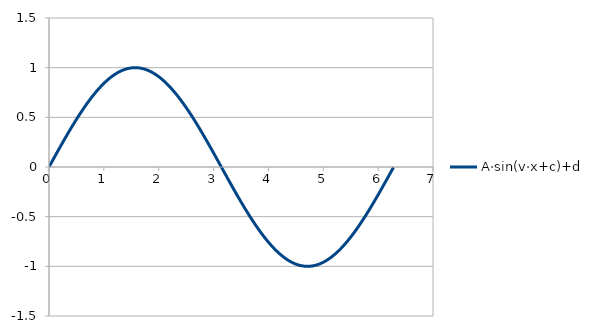
| Category | A·sin(v·x+c)+d |
|---|---|
| 0.0 | 0 |
| 0.00628 | 0.006 |
| 0.01256 | 0.013 |
| 0.01884 | 0.019 |
| 0.02512 | 0.025 |
| 0.0314 | 0.031 |
| 0.03768 | 0.038 |
| 0.04396 | 0.044 |
| 0.05024 | 0.05 |
| 0.05652 | 0.056 |
| 0.0628 | 0.063 |
| 0.06908 | 0.069 |
| 0.07536 | 0.075 |
| 0.08164 | 0.082 |
| 0.08792 | 0.088 |
| 0.0942 | 0.094 |
| 0.10048 | 0.1 |
| 0.10676 | 0.107 |
| 0.11304 | 0.113 |
| 0.11932 | 0.119 |
| 0.1256 | 0.125 |
| 0.13188 | 0.131 |
| 0.13816 | 0.138 |
| 0.14444 | 0.144 |
| 0.15072 | 0.15 |
| 0.157 | 0.156 |
| 0.16328 | 0.163 |
| 0.16956 | 0.169 |
| 0.17584 | 0.175 |
| 0.18212 | 0.181 |
| 0.1884 | 0.187 |
| 0.19468 | 0.193 |
| 0.20096 | 0.2 |
| 0.20724 | 0.206 |
| 0.21352 | 0.212 |
| 0.2198 | 0.218 |
| 0.22608 | 0.224 |
| 0.23236 | 0.23 |
| 0.23864 | 0.236 |
| 0.24492 | 0.242 |
| 0.2512 | 0.249 |
| 0.25748 | 0.255 |
| 0.26376 | 0.261 |
| 0.27004 | 0.267 |
| 0.27632 | 0.273 |
| 0.2826 | 0.279 |
| 0.28888 | 0.285 |
| 0.29516 | 0.291 |
| 0.30144 | 0.297 |
| 0.30772 | 0.303 |
| 0.314 | 0.309 |
| 0.32028 | 0.315 |
| 0.32656 | 0.321 |
| 0.33284 | 0.327 |
| 0.33912 | 0.333 |
| 0.3454 | 0.339 |
| 0.35168 | 0.344 |
| 0.35796 | 0.35 |
| 0.36424 | 0.356 |
| 0.37052 | 0.362 |
| 0.3768 | 0.368 |
| 0.38308 | 0.374 |
| 0.38936 | 0.38 |
| 0.39564 | 0.385 |
| 0.40192 | 0.391 |
| 0.4082 | 0.397 |
| 0.41448 | 0.403 |
| 0.42076 | 0.408 |
| 0.42704 | 0.414 |
| 0.43332 | 0.42 |
| 0.4396 | 0.426 |
| 0.44588 | 0.431 |
| 0.45216 | 0.437 |
| 0.45844 | 0.443 |
| 0.46472 | 0.448 |
| 0.471 | 0.454 |
| 0.47728 | 0.459 |
| 0.48356 | 0.465 |
| 0.48984 | 0.47 |
| 0.49612 | 0.476 |
| 0.5024 | 0.482 |
| 0.50868 | 0.487 |
| 0.51496 | 0.493 |
| 0.52124 | 0.498 |
| 0.52752 | 0.503 |
| 0.5338 | 0.509 |
| 0.54008 | 0.514 |
| 0.54636 | 0.52 |
| 0.55264 | 0.525 |
| 0.55892 | 0.53 |
| 0.5652 | 0.536 |
| 0.57148 | 0.541 |
| 0.57776 | 0.546 |
| 0.58404 | 0.551 |
| 0.59032 | 0.557 |
| 0.5966 | 0.562 |
| 0.60288 | 0.567 |
| 0.60916 | 0.572 |
| 0.61544 | 0.577 |
| 0.62172 | 0.582 |
| 0.627999999999999 | 0.588 |
| 0.634279999999999 | 0.593 |
| 0.640559999999999 | 0.598 |
| 0.646839999999999 | 0.603 |
| 0.653119999999999 | 0.608 |
| 0.659399999999999 | 0.613 |
| 0.665679999999999 | 0.618 |
| 0.671959999999999 | 0.623 |
| 0.678239999999999 | 0.627 |
| 0.684519999999999 | 0.632 |
| 0.690799999999999 | 0.637 |
| 0.697079999999999 | 0.642 |
| 0.703359999999999 | 0.647 |
| 0.709639999999999 | 0.652 |
| 0.715919999999999 | 0.656 |
| 0.722199999999999 | 0.661 |
| 0.728479999999999 | 0.666 |
| 0.734759999999999 | 0.67 |
| 0.741039999999999 | 0.675 |
| 0.747319999999999 | 0.68 |
| 0.753599999999998 | 0.684 |
| 0.759879999999998 | 0.689 |
| 0.766159999999998 | 0.693 |
| 0.772439999999998 | 0.698 |
| 0.778719999999998 | 0.702 |
| 0.784999999999998 | 0.707 |
| 0.791279999999998 | 0.711 |
| 0.797559999999998 | 0.716 |
| 0.803839999999998 | 0.72 |
| 0.810119999999998 | 0.724 |
| 0.816399999999998 | 0.729 |
| 0.822679999999998 | 0.733 |
| 0.828959999999998 | 0.737 |
| 0.835239999999998 | 0.741 |
| 0.841519999999998 | 0.746 |
| 0.847799999999998 | 0.75 |
| 0.854079999999998 | 0.754 |
| 0.860359999999998 | 0.758 |
| 0.866639999999998 | 0.762 |
| 0.872919999999998 | 0.766 |
| 0.879199999999998 | 0.77 |
| 0.885479999999997 | 0.774 |
| 0.891759999999997 | 0.778 |
| 0.898039999999997 | 0.782 |
| 0.904319999999997 | 0.786 |
| 0.910599999999997 | 0.79 |
| 0.916879999999997 | 0.794 |
| 0.923159999999997 | 0.798 |
| 0.929439999999997 | 0.801 |
| 0.935719999999997 | 0.805 |
| 0.941999999999997 | 0.809 |
| 0.948279999999997 | 0.812 |
| 0.954559999999997 | 0.816 |
| 0.960839999999997 | 0.82 |
| 0.967119999999997 | 0.823 |
| 0.973399999999997 | 0.827 |
| 0.979679999999997 | 0.83 |
| 0.985959999999997 | 0.834 |
| 0.992239999999997 | 0.837 |
| 0.998519999999997 | 0.841 |
| 1.0048 | 0.844 |
| 1.01108 | 0.847 |
| 1.01736 | 0.851 |
| 1.02364 | 0.854 |
| 1.02992 | 0.857 |
| 1.0362 | 0.86 |
| 1.04248 | 0.864 |
| 1.04876 | 0.867 |
| 1.05504 | 0.87 |
| 1.06132 | 0.873 |
| 1.0676 | 0.876 |
| 1.07388 | 0.879 |
| 1.08016 | 0.882 |
| 1.08644 | 0.885 |
| 1.09272 | 0.888 |
| 1.099 | 0.891 |
| 1.10528 | 0.894 |
| 1.11156 | 0.896 |
| 1.11784 | 0.899 |
| 1.12412 | 0.902 |
| 1.1304 | 0.905 |
| 1.13668 | 0.907 |
| 1.14296 | 0.91 |
| 1.14924 | 0.912 |
| 1.15552 | 0.915 |
| 1.1618 | 0.918 |
| 1.16808 | 0.92 |
| 1.17436 | 0.922 |
| 1.18064 | 0.925 |
| 1.18692 | 0.927 |
| 1.1932 | 0.93 |
| 1.19948 | 0.932 |
| 1.20576 | 0.934 |
| 1.21204 | 0.936 |
| 1.21832 | 0.939 |
| 1.2246 | 0.941 |
| 1.23088 | 0.943 |
| 1.23716 | 0.945 |
| 1.24344 | 0.947 |
| 1.24972 | 0.949 |
| 1.256 | 0.951 |
| 1.26228 | 0.953 |
| 1.26856 | 0.955 |
| 1.27484 | 0.957 |
| 1.28112 | 0.958 |
| 1.2874 | 0.96 |
| 1.29368 | 0.962 |
| 1.29996 | 0.964 |
| 1.30624 | 0.965 |
| 1.31252 | 0.967 |
| 1.3188 | 0.968 |
| 1.32508 | 0.97 |
| 1.33136 | 0.971 |
| 1.33764 | 0.973 |
| 1.34392 | 0.974 |
| 1.3502 | 0.976 |
| 1.35648 | 0.977 |
| 1.36276 | 0.978 |
| 1.36904 | 0.98 |
| 1.37532 | 0.981 |
| 1.3816 | 0.982 |
| 1.38788 | 0.983 |
| 1.39416 | 0.984 |
| 1.40044 | 0.986 |
| 1.40672 | 0.987 |
| 1.413 | 0.988 |
| 1.41928 | 0.989 |
| 1.42556 | 0.989 |
| 1.43184 | 0.99 |
| 1.43812 | 0.991 |
| 1.4444 | 0.992 |
| 1.45068 | 0.993 |
| 1.45696 | 0.994 |
| 1.46324 | 0.994 |
| 1.46952 | 0.995 |
| 1.4758 | 0.995 |
| 1.48208 | 0.996 |
| 1.48836 | 0.997 |
| 1.49464 | 0.997 |
| 1.50092 | 0.998 |
| 1.5072 | 0.998 |
| 1.51348 | 0.998 |
| 1.51976 | 0.999 |
| 1.52604 | 0.999 |
| 1.53232 | 0.999 |
| 1.5386 | 0.999 |
| 1.54488 | 1 |
| 1.55116 | 1 |
| 1.55744 | 1 |
| 1.56372 | 1 |
| 1.57 | 1 |
| 1.57628 | 1 |
| 1.58256 | 1 |
| 1.58884 | 1 |
| 1.59512 | 1 |
| 1.6014 | 1 |
| 1.60768 | 0.999 |
| 1.61396 | 0.999 |
| 1.62024 | 0.999 |
| 1.62652 | 0.998 |
| 1.6328 | 0.998 |
| 1.63908 | 0.998 |
| 1.64536 | 0.997 |
| 1.65164 | 0.997 |
| 1.65792 | 0.996 |
| 1.6642 | 0.996 |
| 1.67048 | 0.995 |
| 1.67676 | 0.994 |
| 1.68304 | 0.994 |
| 1.68932 | 0.993 |
| 1.6956 | 0.992 |
| 1.70188 | 0.991 |
| 1.70816 | 0.991 |
| 1.71444 | 0.99 |
| 1.72072 | 0.989 |
| 1.727 | 0.988 |
| 1.73328 | 0.987 |
| 1.73956 | 0.986 |
| 1.74584 | 0.985 |
| 1.75212 | 0.984 |
| 1.7584 | 0.982 |
| 1.76468 | 0.981 |
| 1.77096 | 0.98 |
| 1.77724 | 0.979 |
| 1.78352 | 0.977 |
| 1.7898 | 0.976 |
| 1.79608 | 0.975 |
| 1.80236 | 0.973 |
| 1.80864 | 0.972 |
| 1.81492 | 0.97 |
| 1.8212 | 0.969 |
| 1.82748000000001 | 0.967 |
| 1.83376000000001 | 0.966 |
| 1.84004000000001 | 0.964 |
| 1.84632000000001 | 0.962 |
| 1.85260000000001 | 0.961 |
| 1.85888000000001 | 0.959 |
| 1.86516000000001 | 0.957 |
| 1.87144000000001 | 0.955 |
| 1.87772000000001 | 0.953 |
| 1.88400000000001 | 0.951 |
| 1.89028000000001 | 0.949 |
| 1.89656000000001 | 0.947 |
| 1.90284000000001 | 0.945 |
| 1.90912000000001 | 0.943 |
| 1.91540000000001 | 0.941 |
| 1.92168000000001 | 0.939 |
| 1.92796000000001 | 0.937 |
| 1.93424000000001 | 0.935 |
| 1.94052000000001 | 0.932 |
| 1.94680000000001 | 0.93 |
| 1.95308000000001 | 0.928 |
| 1.95936000000001 | 0.925 |
| 1.96564000000001 | 0.923 |
| 1.97192000000001 | 0.921 |
| 1.97820000000001 | 0.918 |
| 1.98448000000001 | 0.916 |
| 1.99076000000001 | 0.913 |
| 1.99704000000001 | 0.911 |
| 2.00332000000001 | 0.908 |
| 2.00960000000001 | 0.905 |
| 2.01588000000001 | 0.903 |
| 2.02216000000001 | 0.9 |
| 2.02844000000001 | 0.897 |
| 2.03472000000001 | 0.894 |
| 2.04100000000001 | 0.891 |
| 2.04728000000001 | 0.889 |
| 2.05356000000001 | 0.886 |
| 2.05984000000001 | 0.883 |
| 2.06612 | 0.88 |
| 2.0724 | 0.877 |
| 2.07868 | 0.874 |
| 2.08496 | 0.871 |
| 2.09124 | 0.868 |
| 2.09752 | 0.864 |
| 2.1038 | 0.861 |
| 2.11008 | 0.858 |
| 2.11636 | 0.855 |
| 2.12264 | 0.852 |
| 2.12892 | 0.848 |
| 2.1352 | 0.845 |
| 2.14148 | 0.842 |
| 2.14776 | 0.838 |
| 2.15404 | 0.835 |
| 2.16032 | 0.831 |
| 2.1666 | 0.828 |
| 2.17288 | 0.824 |
| 2.17916 | 0.821 |
| 2.18544 | 0.817 |
| 2.19172 | 0.813 |
| 2.198 | 0.81 |
| 2.20428 | 0.806 |
| 2.21056 | 0.802 |
| 2.21684 | 0.798 |
| 2.22312 | 0.795 |
| 2.2294 | 0.791 |
| 2.23568 | 0.787 |
| 2.24196 | 0.783 |
| 2.24824 | 0.779 |
| 2.25452 | 0.775 |
| 2.2608 | 0.771 |
| 2.26708 | 0.767 |
| 2.27336 | 0.763 |
| 2.27964 | 0.759 |
| 2.28592 | 0.755 |
| 2.2922 | 0.751 |
| 2.29848 | 0.747 |
| 2.30476 | 0.743 |
| 2.31104 | 0.738 |
| 2.31732 | 0.734 |
| 2.3236 | 0.73 |
| 2.32988 | 0.725 |
| 2.33616 | 0.721 |
| 2.34244 | 0.717 |
| 2.34872 | 0.712 |
| 2.355 | 0.708 |
| 2.36128 | 0.704 |
| 2.36756 | 0.699 |
| 2.37384 | 0.695 |
| 2.38012 | 0.69 |
| 2.3864 | 0.685 |
| 2.39268 | 0.681 |
| 2.39896 | 0.676 |
| 2.40524 | 0.672 |
| 2.41152 | 0.667 |
| 2.4178 | 0.662 |
| 2.42408 | 0.658 |
| 2.43036 | 0.653 |
| 2.43664 | 0.648 |
| 2.44292 | 0.643 |
| 2.4492 | 0.638 |
| 2.45548 | 0.634 |
| 2.46175999999999 | 0.629 |
| 2.46803999999999 | 0.624 |
| 2.47431999999999 | 0.619 |
| 2.48059999999999 | 0.614 |
| 2.48687999999999 | 0.609 |
| 2.49315999999999 | 0.604 |
| 2.49943999999999 | 0.599 |
| 2.50571999999999 | 0.594 |
| 2.51199999999999 | 0.589 |
| 2.51827999999999 | 0.584 |
| 2.52455999999999 | 0.579 |
| 2.53083999999999 | 0.573 |
| 2.53711999999999 | 0.568 |
| 2.54339999999999 | 0.563 |
| 2.54967999999999 | 0.558 |
| 2.55595999999999 | 0.553 |
| 2.56223999999999 | 0.547 |
| 2.56851999999999 | 0.542 |
| 2.57479999999999 | 0.537 |
| 2.58107999999999 | 0.532 |
| 2.58735999999999 | 0.526 |
| 2.59363999999999 | 0.521 |
| 2.59991999999999 | 0.516 |
| 2.60619999999999 | 0.51 |
| 2.61247999999999 | 0.505 |
| 2.61875999999999 | 0.499 |
| 2.62503999999999 | 0.494 |
| 2.63131999999999 | 0.488 |
| 2.63759999999999 | 0.483 |
| 2.64387999999999 | 0.477 |
| 2.65015999999999 | 0.472 |
| 2.65643999999999 | 0.466 |
| 2.66271999999999 | 0.461 |
| 2.66899999999999 | 0.455 |
| 2.67527999999999 | 0.45 |
| 2.68155999999999 | 0.444 |
| 2.68783999999999 | 0.438 |
| 2.69411999999999 | 0.433 |
| 2.70039999999999 | 0.427 |
| 2.70667999999999 | 0.421 |
| 2.71295999999999 | 0.416 |
| 2.71923999999999 | 0.41 |
| 2.72551999999999 | 0.404 |
| 2.73179999999999 | 0.398 |
| 2.73807999999999 | 0.393 |
| 2.74435999999999 | 0.387 |
| 2.75063999999999 | 0.381 |
| 2.75691999999999 | 0.375 |
| 2.76319999999999 | 0.369 |
| 2.76947999999999 | 0.364 |
| 2.77575999999999 | 0.358 |
| 2.78203999999999 | 0.352 |
| 2.78831999999999 | 0.346 |
| 2.79459999999999 | 0.34 |
| 2.80087999999999 | 0.334 |
| 2.80715999999999 | 0.328 |
| 2.81343999999999 | 0.322 |
| 2.81971999999999 | 0.316 |
| 2.82599999999999 | 0.31 |
| 2.83227999999999 | 0.304 |
| 2.83855999999999 | 0.298 |
| 2.84483999999999 | 0.292 |
| 2.85111999999999 | 0.286 |
| 2.85739999999998 | 0.28 |
| 2.86367999999998 | 0.274 |
| 2.86995999999998 | 0.268 |
| 2.87623999999998 | 0.262 |
| 2.88251999999998 | 0.256 |
| 2.88879999999998 | 0.25 |
| 2.89507999999998 | 0.244 |
| 2.90135999999998 | 0.238 |
| 2.90763999999998 | 0.232 |
| 2.91391999999998 | 0.226 |
| 2.92019999999998 | 0.22 |
| 2.92647999999998 | 0.213 |
| 2.93275999999998 | 0.207 |
| 2.93903999999998 | 0.201 |
| 2.94531999999998 | 0.195 |
| 2.95159999999998 | 0.189 |
| 2.95787999999998 | 0.183 |
| 2.96415999999998 | 0.177 |
| 2.97043999999998 | 0.17 |
| 2.97671999999998 | 0.164 |
| 2.98299999999998 | 0.158 |
| 2.98927999999998 | 0.152 |
| 2.99555999999998 | 0.146 |
| 3.00183999999998 | 0.139 |
| 3.00811999999998 | 0.133 |
| 3.01439999999998 | 0.127 |
| 3.02067999999998 | 0.121 |
| 3.02695999999998 | 0.114 |
| 3.03323999999998 | 0.108 |
| 3.03951999999998 | 0.102 |
| 3.04579999999998 | 0.096 |
| 3.05207999999998 | 0.089 |
| 3.05835999999998 | 0.083 |
| 3.06463999999998 | 0.077 |
| 3.07091999999998 | 0.071 |
| 3.07719999999998 | 0.064 |
| 3.08347999999998 | 0.058 |
| 3.08975999999998 | 0.052 |
| 3.09603999999998 | 0.046 |
| 3.10231999999998 | 0.039 |
| 3.10859999999998 | 0.033 |
| 3.11487999999998 | 0.027 |
| 3.12115999999998 | 0.02 |
| 3.12743999999998 | 0.014 |
| 3.13371999999998 | 0.008 |
| 3.13999999999998 | 0.002 |
| 3.14627999999998 | -0.005 |
| 3.15255999999998 | -0.011 |
| 3.15883999999998 | -0.017 |
| 3.16511999999998 | -0.024 |
| 3.17139999999998 | -0.03 |
| 3.17767999999998 | -0.036 |
| 3.18395999999998 | -0.042 |
| 3.19023999999998 | -0.049 |
| 3.19651999999998 | -0.055 |
| 3.20279999999998 | -0.061 |
| 3.20907999999998 | -0.067 |
| 3.21535999999998 | -0.074 |
| 3.22163999999998 | -0.08 |
| 3.22791999999998 | -0.086 |
| 3.23419999999998 | -0.092 |
| 3.24047999999998 | -0.099 |
| 3.24675999999998 | -0.105 |
| 3.25303999999997 | -0.111 |
| 3.25931999999997 | -0.117 |
| 3.26559999999997 | -0.124 |
| 3.27187999999997 | -0.13 |
| 3.27815999999997 | -0.136 |
| 3.28443999999997 | -0.142 |
| 3.29071999999997 | -0.149 |
| 3.29699999999997 | -0.155 |
| 3.30327999999997 | -0.161 |
| 3.30955999999997 | -0.167 |
| 3.31583999999997 | -0.173 |
| 3.32211999999997 | -0.18 |
| 3.32839999999997 | -0.186 |
| 3.33467999999997 | -0.192 |
| 3.34095999999997 | -0.198 |
| 3.34723999999997 | -0.204 |
| 3.35351999999997 | -0.21 |
| 3.35979999999997 | -0.216 |
| 3.36607999999997 | -0.223 |
| 3.37235999999997 | -0.229 |
| 3.37863999999997 | -0.235 |
| 3.38491999999997 | -0.241 |
| 3.39119999999997 | -0.247 |
| 3.39747999999997 | -0.253 |
| 3.40375999999997 | -0.259 |
| 3.41003999999997 | -0.265 |
| 3.41631999999997 | -0.271 |
| 3.42259999999997 | -0.277 |
| 3.42887999999997 | -0.283 |
| 3.43515999999997 | -0.289 |
| 3.44143999999997 | -0.295 |
| 3.44771999999997 | -0.301 |
| 3.45399999999997 | -0.307 |
| 3.46027999999997 | -0.313 |
| 3.46655999999997 | -0.319 |
| 3.47283999999997 | -0.325 |
| 3.47911999999997 | -0.331 |
| 3.48539999999997 | -0.337 |
| 3.49167999999997 | -0.343 |
| 3.49795999999997 | -0.349 |
| 3.50423999999997 | -0.355 |
| 3.51051999999997 | -0.361 |
| 3.51679999999997 | -0.366 |
| 3.52307999999997 | -0.372 |
| 3.52935999999997 | -0.378 |
| 3.53563999999997 | -0.384 |
| 3.54191999999997 | -0.39 |
| 3.54819999999997 | -0.395 |
| 3.55447999999997 | -0.401 |
| 3.56075999999997 | -0.407 |
| 3.56703999999997 | -0.413 |
| 3.57331999999997 | -0.418 |
| 3.57959999999997 | -0.424 |
| 3.58587999999997 | -0.43 |
| 3.59215999999997 | -0.435 |
| 3.59843999999997 | -0.441 |
| 3.60471999999997 | -0.447 |
| 3.61099999999997 | -0.452 |
| 3.61727999999997 | -0.458 |
| 3.62355999999997 | -0.464 |
| 3.62983999999997 | -0.469 |
| 3.63611999999997 | -0.475 |
| 3.64239999999997 | -0.48 |
| 3.64867999999996 | -0.486 |
| 3.65495999999996 | -0.491 |
| 3.66123999999996 | -0.497 |
| 3.66751999999996 | -0.502 |
| 3.67379999999996 | -0.507 |
| 3.68007999999996 | -0.513 |
| 3.68635999999996 | -0.518 |
| 3.69263999999996 | -0.524 |
| 3.69891999999996 | -0.529 |
| 3.70519999999996 | -0.534 |
| 3.71147999999996 | -0.54 |
| 3.71775999999996 | -0.545 |
| 3.72403999999996 | -0.55 |
| 3.73031999999996 | -0.555 |
| 3.73659999999996 | -0.561 |
| 3.74287999999996 | -0.566 |
| 3.74915999999996 | -0.571 |
| 3.75543999999996 | -0.576 |
| 3.76171999999996 | -0.581 |
| 3.76799999999996 | -0.586 |
| 3.77427999999996 | -0.591 |
| 3.78055999999996 | -0.596 |
| 3.78683999999996 | -0.601 |
| 3.79311999999996 | -0.606 |
| 3.79939999999996 | -0.611 |
| 3.80567999999996 | -0.616 |
| 3.81195999999996 | -0.621 |
| 3.81823999999996 | -0.626 |
| 3.82451999999996 | -0.631 |
| 3.83079999999996 | -0.636 |
| 3.83707999999996 | -0.641 |
| 3.84335999999996 | -0.646 |
| 3.84963999999996 | -0.65 |
| 3.85591999999996 | -0.655 |
| 3.86219999999996 | -0.66 |
| 3.86847999999996 | -0.665 |
| 3.87475999999996 | -0.669 |
| 3.88103999999996 | -0.674 |
| 3.88731999999996 | -0.679 |
| 3.89359999999996 | -0.683 |
| 3.89987999999996 | -0.688 |
| 3.90615999999996 | -0.692 |
| 3.91243999999996 | -0.697 |
| 3.91871999999996 | -0.701 |
| 3.92499999999996 | -0.706 |
| 3.93127999999996 | -0.71 |
| 3.93755999999996 | -0.715 |
| 3.94383999999996 | -0.719 |
| 3.95011999999996 | -0.723 |
| 3.95639999999996 | -0.728 |
| 3.96267999999996 | -0.732 |
| 3.96895999999996 | -0.736 |
| 3.97523999999996 | -0.74 |
| 3.98151999999996 | -0.745 |
| 3.98779999999996 | -0.749 |
| 3.99407999999996 | -0.753 |
| 4.00035999999996 | -0.757 |
| 4.00663999999996 | -0.761 |
| 4.01291999999996 | -0.765 |
| 4.01919999999996 | -0.769 |
| 4.02547999999996 | -0.773 |
| 4.03175999999996 | -0.777 |
| 4.03803999999996 | -0.781 |
| 4.04431999999996 | -0.785 |
| 4.05059999999996 | -0.789 |
| 4.05687999999996 | -0.793 |
| 4.06315999999996 | -0.797 |
| 4.06943999999996 | -0.8 |
| 4.07571999999996 | -0.804 |
| 4.08199999999996 | -0.808 |
| 4.08827999999996 | -0.811 |
| 4.09455999999996 | -0.815 |
| 4.10083999999996 | -0.819 |
| 4.10711999999996 | -0.822 |
| 4.11339999999996 | -0.826 |
| 4.11967999999996 | -0.829 |
| 4.12595999999996 | -0.833 |
| 4.13223999999996 | -0.836 |
| 4.13851999999996 | -0.84 |
| 4.14479999999996 | -0.843 |
| 4.15107999999996 | -0.847 |
| 4.15735999999996 | -0.85 |
| 4.16363999999996 | -0.853 |
| 4.16991999999996 | -0.856 |
| 4.17619999999996 | -0.86 |
| 4.18247999999996 | -0.863 |
| 4.18875999999997 | -0.866 |
| 4.19503999999997 | -0.869 |
| 4.20131999999997 | -0.872 |
| 4.20759999999997 | -0.875 |
| 4.21387999999997 | -0.878 |
| 4.22015999999997 | -0.881 |
| 4.22643999999997 | -0.884 |
| 4.23271999999997 | -0.887 |
| 4.23899999999997 | -0.89 |
| 4.24527999999997 | -0.893 |
| 4.25155999999997 | -0.896 |
| 4.25783999999997 | -0.898 |
| 4.26411999999997 | -0.901 |
| 4.27039999999997 | -0.904 |
| 4.27667999999997 | -0.907 |
| 4.28295999999997 | -0.909 |
| 4.28923999999997 | -0.912 |
| 4.29551999999997 | -0.914 |
| 4.30179999999997 | -0.917 |
| 4.30807999999997 | -0.919 |
| 4.31435999999997 | -0.922 |
| 4.32063999999997 | -0.924 |
| 4.32691999999997 | -0.927 |
| 4.33319999999997 | -0.929 |
| 4.33947999999997 | -0.931 |
| 4.34575999999997 | -0.934 |
| 4.35203999999997 | -0.936 |
| 4.35831999999997 | -0.938 |
| 4.36459999999997 | -0.94 |
| 4.37087999999997 | -0.942 |
| 4.37715999999997 | -0.944 |
| 4.38343999999997 | -0.946 |
| 4.38971999999997 | -0.948 |
| 4.39599999999997 | -0.95 |
| 4.40227999999997 | -0.952 |
| 4.40855999999998 | -0.954 |
| 4.41483999999998 | -0.956 |
| 4.42111999999998 | -0.958 |
| 4.42739999999998 | -0.96 |
| 4.43367999999998 | -0.961 |
| 4.43995999999998 | -0.963 |
| 4.44623999999998 | -0.965 |
| 4.45251999999998 | -0.966 |
| 4.45879999999998 | -0.968 |
| 4.46507999999998 | -0.97 |
| 4.47135999999998 | -0.971 |
| 4.47763999999998 | -0.973 |
| 4.48391999999998 | -0.974 |
| 4.49019999999998 | -0.975 |
| 4.49647999999998 | -0.977 |
| 4.50275999999998 | -0.978 |
| 4.50903999999998 | -0.979 |
| 4.51531999999998 | -0.981 |
| 4.52159999999998 | -0.982 |
| 4.52787999999998 | -0.983 |
| 4.53415999999998 | -0.984 |
| 4.54043999999998 | -0.985 |
| 4.54671999999998 | -0.986 |
| 4.55299999999998 | -0.987 |
| 4.55927999999998 | -0.988 |
| 4.56555999999998 | -0.989 |
| 4.57183999999998 | -0.99 |
| 4.57811999999998 | -0.991 |
| 4.58439999999998 | -0.992 |
| 4.59067999999998 | -0.993 |
| 4.59695999999998 | -0.993 |
| 4.60323999999998 | -0.994 |
| 4.60951999999998 | -0.995 |
| 4.61579999999998 | -0.995 |
| 4.62207999999998 | -0.996 |
| 4.62835999999999 | -0.996 |
| 4.63463999999999 | -0.997 |
| 4.64091999999999 | -0.997 |
| 4.64719999999999 | -0.998 |
| 4.65347999999999 | -0.998 |
| 4.65975999999999 | -0.999 |
| 4.66603999999999 | -0.999 |
| 4.67231999999999 | -0.999 |
| 4.67859999999999 | -0.999 |
| 4.68487999999999 | -1 |
| 4.69115999999999 | -1 |
| 4.69743999999999 | -1 |
| 4.70371999999999 | -1 |
| 4.70999999999999 | -1 |
| 4.71627999999999 | -1 |
| 4.72255999999999 | -1 |
| 4.72883999999999 | -1 |
| 4.73511999999999 | -1 |
| 4.74139999999999 | -1 |
| 4.74767999999999 | -0.999 |
| 4.75395999999999 | -0.999 |
| 4.76023999999999 | -0.999 |
| 4.76651999999999 | -0.999 |
| 4.77279999999999 | -0.998 |
| 4.77907999999999 | -0.998 |
| 4.78535999999999 | -0.997 |
| 4.79163999999999 | -0.997 |
| 4.79791999999999 | -0.996 |
| 4.80419999999999 | -0.996 |
| 4.81047999999999 | -0.995 |
| 4.81675999999999 | -0.995 |
| 4.82303999999999 | -0.994 |
| 4.82931999999999 | -0.993 |
| 4.83559999999999 | -0.992 |
| 4.84187999999999 | -0.992 |
| 4.84816 | -0.991 |
| 4.85444 | -0.99 |
| 4.86072 | -0.989 |
| 4.867 | -0.988 |
| 4.87328 | -0.987 |
| 4.87956 | -0.986 |
| 4.88584 | -0.985 |
| 4.89212 | -0.984 |
| 4.8984 | -0.983 |
| 4.90468 | -0.982 |
| 4.91096 | -0.98 |
| 4.91724 | -0.979 |
| 4.92352 | -0.978 |
| 4.9298 | -0.976 |
| 4.93608 | -0.975 |
| 4.94236 | -0.974 |
| 4.94864 | -0.972 |
| 4.95492 | -0.971 |
| 4.9612 | -0.969 |
| 4.96748 | -0.968 |
| 4.97376 | -0.966 |
| 4.98004 | -0.964 |
| 4.98632 | -0.963 |
| 4.9926 | -0.961 |
| 4.99888 | -0.959 |
| 5.00516 | -0.957 |
| 5.01144 | -0.956 |
| 5.01772 | -0.954 |
| 5.024 | -0.952 |
| 5.03028 | -0.95 |
| 5.03656 | -0.948 |
| 5.04284 | -0.946 |
| 5.04912 | -0.944 |
| 5.0554 | -0.942 |
| 5.06168 | -0.94 |
| 5.06796000000001 | -0.937 |
| 5.07424000000001 | -0.935 |
| 5.08052000000001 | -0.933 |
| 5.08680000000001 | -0.931 |
| 5.09308000000001 | -0.928 |
| 5.09936000000001 | -0.926 |
| 5.10564000000001 | -0.924 |
| 5.11192000000001 | -0.921 |
| 5.11820000000001 | -0.919 |
| 5.12448000000001 | -0.916 |
| 5.13076000000001 | -0.914 |
| 5.13704000000001 | -0.911 |
| 5.14332000000001 | -0.909 |
| 5.14960000000001 | -0.906 |
| 5.15588000000001 | -0.903 |
| 5.16216000000001 | -0.901 |
| 5.16844000000001 | -0.898 |
| 5.17472000000001 | -0.895 |
| 5.18100000000001 | -0.892 |
| 5.18728000000001 | -0.889 |
| 5.19356000000001 | -0.886 |
| 5.19984000000001 | -0.884 |
| 5.20612000000001 | -0.881 |
| 5.21240000000001 | -0.878 |
| 5.21868000000001 | -0.875 |
| 5.22496000000001 | -0.871 |
| 5.23124000000001 | -0.868 |
| 5.23752000000001 | -0.865 |
| 5.24380000000001 | -0.862 |
| 5.25008000000001 | -0.859 |
| 5.25636000000001 | -0.856 |
| 5.26264000000001 | -0.852 |
| 5.26892000000001 | -0.849 |
| 5.27520000000001 | -0.846 |
| 5.28148000000001 | -0.842 |
| 5.28776000000001 | -0.839 |
| 5.29404000000002 | -0.836 |
| 5.30032000000002 | -0.832 |
| 5.30660000000002 | -0.829 |
| 5.31288000000002 | -0.825 |
| 5.31916000000002 | -0.821 |
| 5.32544000000002 | -0.818 |
| 5.33172000000002 | -0.814 |
| 5.33800000000002 | -0.811 |
| 5.34428000000002 | -0.807 |
| 5.35056000000002 | -0.803 |
| 5.35684000000002 | -0.799 |
| 5.36312000000002 | -0.796 |
| 5.36940000000002 | -0.792 |
| 5.37568000000002 | -0.788 |
| 5.38196000000002 | -0.784 |
| 5.38824000000002 | -0.78 |
| 5.39452000000002 | -0.776 |
| 5.40080000000002 | -0.772 |
| 5.40708000000002 | -0.768 |
| 5.41336000000002 | -0.764 |
| 5.41964000000002 | -0.76 |
| 5.42592000000002 | -0.756 |
| 5.43220000000002 | -0.752 |
| 5.43848000000002 | -0.748 |
| 5.44476000000002 | -0.744 |
| 5.45104000000002 | -0.739 |
| 5.45732000000002 | -0.735 |
| 5.46360000000002 | -0.731 |
| 5.46988000000002 | -0.727 |
| 5.47616000000002 | -0.722 |
| 5.48244000000002 | -0.718 |
| 5.48872000000002 | -0.713 |
| 5.49500000000002 | -0.709 |
| 5.50128000000002 | -0.705 |
| 5.50756000000002 | -0.7 |
| 5.51384000000003 | -0.696 |
| 5.52012000000003 | -0.691 |
| 5.52640000000003 | -0.687 |
| 5.53268000000003 | -0.682 |
| 5.53896000000003 | -0.677 |
| 5.54524000000003 | -0.673 |
| 5.55152000000003 | -0.668 |
| 5.55780000000003 | -0.663 |
| 5.56408000000003 | -0.659 |
| 5.57036000000003 | -0.654 |
| 5.57664000000003 | -0.649 |
| 5.58292000000003 | -0.644 |
| 5.58920000000003 | -0.64 |
| 5.59548000000003 | -0.635 |
| 5.60176000000003 | -0.63 |
| 5.60804000000003 | -0.625 |
| 5.61432000000003 | -0.62 |
| 5.62060000000003 | -0.615 |
| 5.62688000000003 | -0.61 |
| 5.63316000000003 | -0.605 |
| 5.63944000000003 | -0.6 |
| 5.64572000000003 | -0.595 |
| 5.65200000000003 | -0.59 |
| 5.65828000000003 | -0.585 |
| 5.66456000000003 | -0.58 |
| 5.67084000000003 | -0.575 |
| 5.67712000000003 | -0.57 |
| 5.68340000000003 | -0.564 |
| 5.68968000000003 | -0.559 |
| 5.69596000000003 | -0.554 |
| 5.70224000000003 | -0.549 |
| 5.70852000000003 | -0.544 |
| 5.71480000000003 | -0.538 |
| 5.72108000000003 | -0.533 |
| 5.72736000000003 | -0.528 |
| 5.73364000000004 | -0.522 |
| 5.73992000000004 | -0.517 |
| 5.74620000000004 | -0.512 |
| 5.75248000000004 | -0.506 |
| 5.75876000000004 | -0.501 |
| 5.76504000000004 | -0.495 |
| 5.77132000000004 | -0.49 |
| 5.77760000000004 | -0.484 |
| 5.78388000000004 | -0.479 |
| 5.79016000000004 | -0.473 |
| 5.79644000000004 | -0.468 |
| 5.80272000000004 | -0.462 |
| 5.80900000000004 | -0.457 |
| 5.81528000000004 | -0.451 |
| 5.82156000000004 | -0.445 |
| 5.82784000000004 | -0.44 |
| 5.83412000000004 | -0.434 |
| 5.84040000000004 | -0.428 |
| 5.84668000000004 | -0.423 |
| 5.85296000000004 | -0.417 |
| 5.85924000000004 | -0.411 |
| 5.86552000000004 | -0.406 |
| 5.87180000000004 | -0.4 |
| 5.87808000000004 | -0.394 |
| 5.88436000000004 | -0.388 |
| 5.89064000000004 | -0.383 |
| 5.89692000000004 | -0.377 |
| 5.90320000000004 | -0.371 |
| 5.90948000000004 | -0.365 |
| 5.91576000000004 | -0.359 |
| 5.92204000000004 | -0.353 |
| 5.92832000000004 | -0.347 |
| 5.93460000000004 | -0.342 |
| 5.94088000000004 | -0.336 |
| 5.94716000000004 | -0.33 |
| 5.95344000000005 | -0.324 |
| 5.95972000000005 | -0.318 |
| 5.96600000000005 | -0.312 |
| 5.97228000000005 | -0.306 |
| 5.97856000000005 | -0.3 |
| 5.98484000000005 | -0.294 |
| 5.99112000000005 | -0.288 |
| 5.99740000000005 | -0.282 |
| 6.00368000000005 | -0.276 |
| 6.00996000000005 | -0.27 |
| 6.01624000000005 | -0.264 |
| 6.02252000000005 | -0.258 |
| 6.02880000000005 | -0.252 |
| 6.03508000000005 | -0.246 |
| 6.04136000000005 | -0.239 |
| 6.04764000000005 | -0.233 |
| 6.05392000000005 | -0.227 |
| 6.06020000000005 | -0.221 |
| 6.06648000000005 | -0.215 |
| 6.07276000000005 | -0.209 |
| 6.07904000000005 | -0.203 |
| 6.08532000000005 | -0.197 |
| 6.09160000000005 | -0.19 |
| 6.09788000000005 | -0.184 |
| 6.10416000000005 | -0.178 |
| 6.11044000000005 | -0.172 |
| 6.11672000000005 | -0.166 |
| 6.12300000000005 | -0.16 |
| 6.12928000000005 | -0.153 |
| 6.13556000000005 | -0.147 |
| 6.14184000000005 | -0.141 |
| 6.14812000000005 | -0.135 |
| 6.15440000000005 | -0.128 |
| 6.16068000000005 | -0.122 |
| 6.16696000000005 | -0.116 |
| 6.17324000000006 | -0.11 |
| 6.17952000000006 | -0.103 |
| 6.18580000000006 | -0.097 |
| 6.19208000000006 | -0.091 |
| 6.19836000000006 | -0.085 |
| 6.20464000000006 | -0.078 |
| 6.21092000000006 | -0.072 |
| 6.21720000000006 | -0.066 |
| 6.22348000000006 | -0.06 |
| 6.22976000000006 | -0.053 |
| 6.23604000000006 | -0.047 |
| 6.24232000000006 | -0.041 |
| 6.24860000000006 | -0.035 |
| 6.25488000000006 | -0.028 |
| 6.26116000000006 | -0.022 |
| 6.26744000000006 | -0.016 |
| 6.27372000000006 | -0.009 |
| 6.28000000000006 | -0.003 |
| 6.28628000000006 | 0.003 |